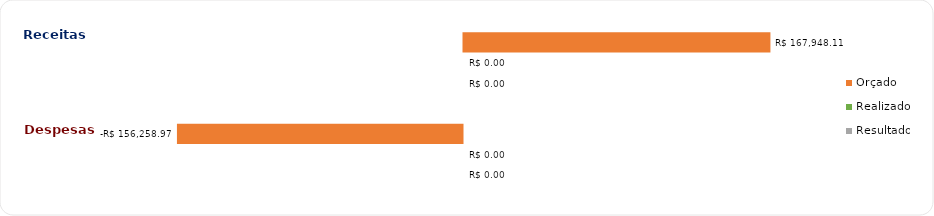
| Category | Orçado | Realizado | Resultado |
|---|---|---|---|
| Receitas totais | 167948.11 | 0 | 0 |
| Despesas totais | -156258.969 | 0 | 0 |